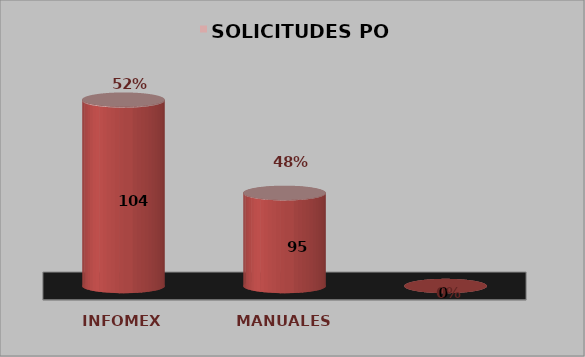
| Category | SOLICITUDES POR TIPO | Series 1 |
|---|---|---|
| INFOMEX | 0.667 | 140 |
| MANUALES | 0.333 | 70 |